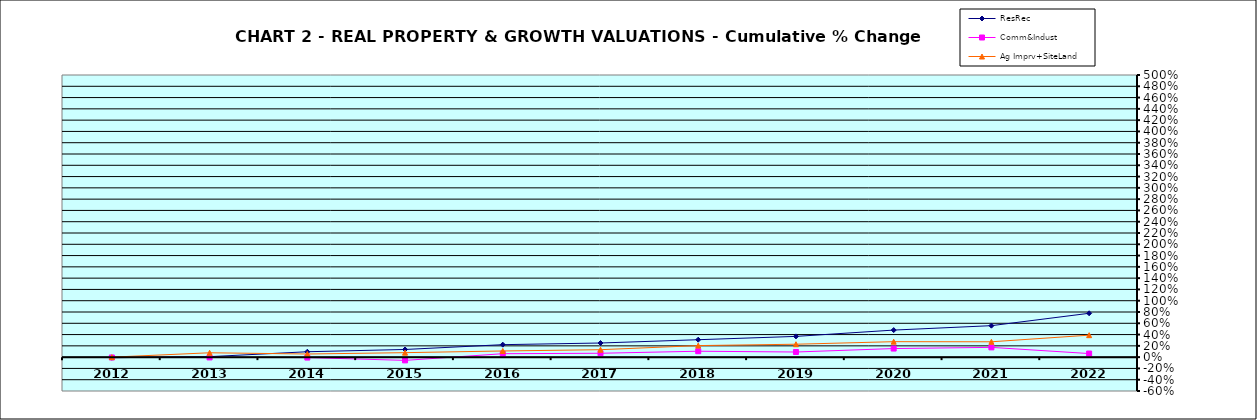
| Category | ResRec | Comm&Indust | Ag Imprv+SiteLand |
|---|---|---|---|
| 2012.0 | -0.01 | -0.006 | 0 |
| 2013.0 | 0.009 | -0.005 | 0.077 |
| 2014.0 | 0.096 | -0.008 | 0.056 |
| 2015.0 | 0.136 | -0.057 | 0.079 |
| 2016.0 | 0.221 | 0.061 | 0.109 |
| 2017.0 | 0.25 | 0.069 | 0.132 |
| 2018.0 | 0.309 | 0.105 | 0.205 |
| 2019.0 | 0.368 | 0.091 | 0.229 |
| 2020.0 | 0.48 | 0.152 | 0.274 |
| 2021.0 | 0.558 | 0.173 | 0.272 |
| 2022.0 | 0.777 | 0.064 | 0.389 |